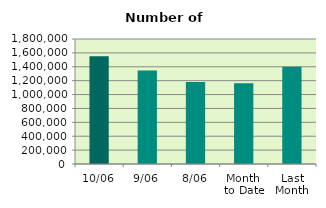
| Category | Series 0 |
|---|---|
| 10/06 | 1551108 |
| 9/06 | 1345746 |
| 8/06 | 1179170 |
| Month 
to Date | 1163381 |
| Last
Month | 1401172.455 |